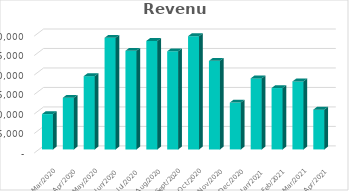
| Category | Revenue |
|---|---|
| 2021-04-30 | 10211 |
| 2021-03-31 | 17445 |
| 2021-02-28 | 15750 |
| 2021-01-31 | 18233 |
| 2020-12-31 | 12032 |
| 2020-11-30 | 22734 |
| 2020-10-31 | 29071 |
| 2020-09-30 | 25187 |
| 2020-08-31 | 27853 |
| 2020-07-31 | 25331 |
| 2020-06-30 | 28658 |
| 2020-05-31 | 18796 |
| 2020-04-30 | 13266 |
| 2020-03-31 | 9063 |